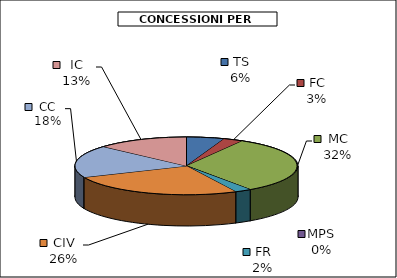
| Category | Series 0 |
|---|---|
| TS | 4270700 |
| FC | 2220000 |
| MC | 24811000 |
| MPS | 0 |
| FR | 1864000 |
| CIV | 20025000 |
| CC | 14045750 |
| IC | 10387500 |